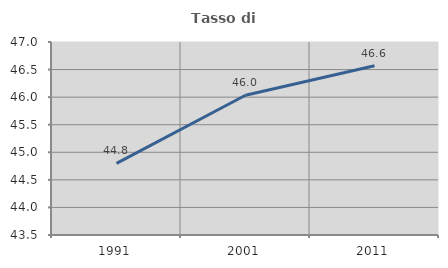
| Category | Tasso di occupazione   |
|---|---|
| 1991.0 | 44.798 |
| 2001.0 | 46.034 |
| 2011.0 | 46.57 |